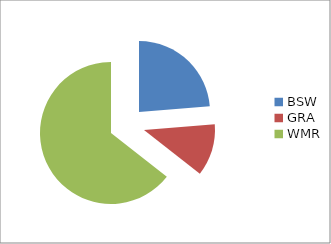
| Category | Series 0 |
|---|---|
| BSW | 14 |
| GRA | 7 |
| WMR | 38 |